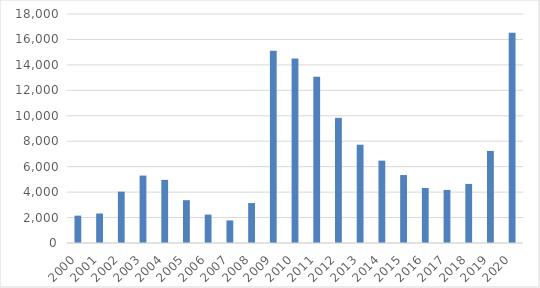
| Category | Series 0 |
|---|---|
| 2000.0 | 2149 |
| 2001.0 | 2319 |
| 2002.0 | 4037 |
| 2003.0 | 5299 |
| 2004.0 | 4962 |
| 2005.0 | 3366 |
| 2006.0 | 2231 |
| 2007.0 | 1774 |
| 2008.0 | 3139 |
| 2009.0 | 15121 |
| 2010.0 | 14503 |
| 2011.0 | 13066 |
| 2012.0 | 9838 |
| 2013.0 | 7726 |
| 2014.0 | 6474 |
| 2015.0 | 5342 |
| 2016.0 | 4324 |
| 2017.0 | 4171 |
| 2018.0 | 4643 |
| 2019.0 | 7238 |
| 2020.0 | 16522.5 |